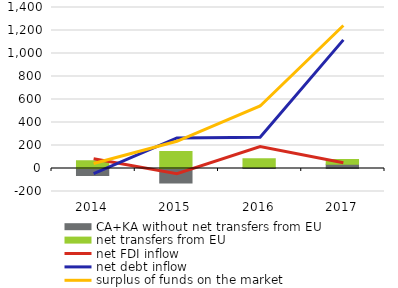
| Category | CA+KA without net transfers from EU | net transfers from EU |
|---|---|---|
| 2014.0 | -60.1 | 67.8 |
| 2015.0 | -126.4 | 147.1 |
| 2016.0 | 8.5 | 76.7 |
| 2017.0 | 37.9 | 41.2 |